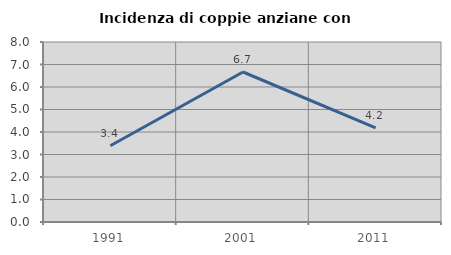
| Category | Incidenza di coppie anziane con figli |
|---|---|
| 1991.0 | 3.39 |
| 2001.0 | 6.667 |
| 2011.0 | 4.181 |